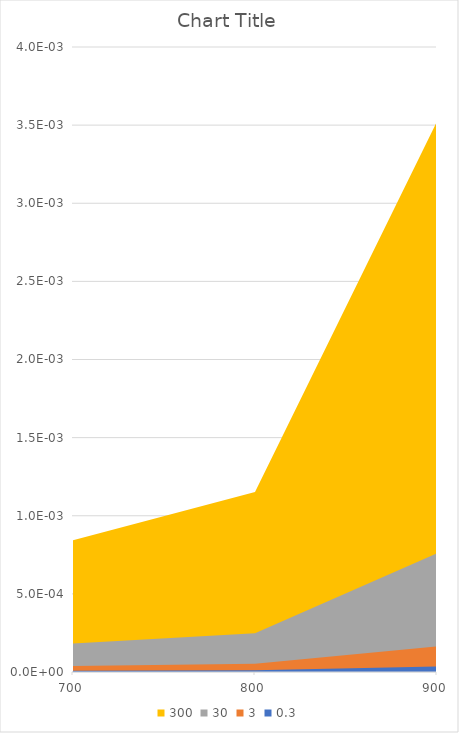
| Category | 300 | 30 | 3 | 0.3 |
|---|---|---|---|---|
| 700.0 | 0.001 | 0 | 0 | 0 |
| 800.0 | 0.001 | 0 | 0 | 0 |
| 900.0 | 0.004 | 0.001 | 0 | 0 |